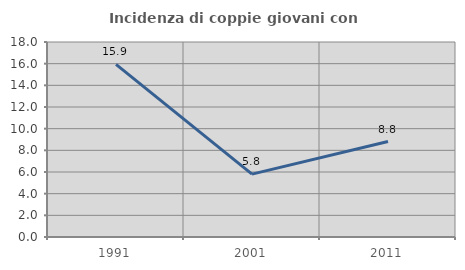
| Category | Incidenza di coppie giovani con figli |
|---|---|
| 1991.0 | 15.929 |
| 2001.0 | 5.804 |
| 2011.0 | 8.811 |